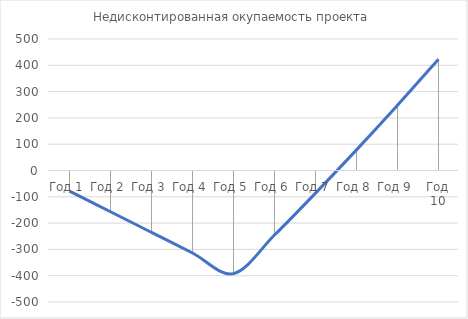
| Category | Недисконтированная окупаемость проекта |
|---|---|
| Год 1 | -78.4 |
| Год 2 | -156.8 |
| Год 3 | -235.2 |
| Год 4 | -313.6 |
| Год 5 | -392 |
| Год 6 | -245.448 |
| Год 7 | -86.107 |
| Год 8 | 78.356 |
| Год 9 | 248.103 |
| Год 10 | 423.303 |